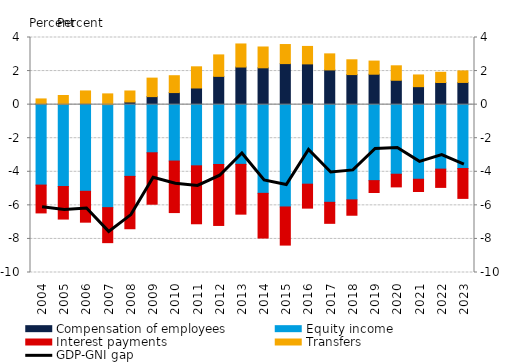
| Category | Compensation of employees | Equity income | Interest payments | Transfers |
|---|---|---|---|---|
| 2004.0 | 0.05 | -4.792 | -1.658 | 0.291 |
| 2005.0 | 0.026 | -4.878 | -1.939 | 0.519 |
| 2006.0 | 0.074 | -5.162 | -1.84 | 0.742 |
| 2007.0 | 0.004 | -6.136 | -2.086 | 0.637 |
| 2008.0 | 0.158 | -4.273 | -3.12 | 0.656 |
| 2009.0 | 0.479 | -2.868 | -3.065 | 1.101 |
| 2010.0 | 0.719 | -3.36 | -3.07 | 1.004 |
| 2011.0 | 0.992 | -3.645 | -3.452 | 1.262 |
| 2012.0 | 1.685 | -3.565 | -3.632 | 1.279 |
| 2013.0 | 2.241 | -3.558 | -2.966 | 1.374 |
| 2014.0 | 2.194 | -5.284 | -2.664 | 1.24 |
| 2015.0 | 2.445 | -6.096 | -2.272 | 1.136 |
| 2016.0 | 2.428 | -4.738 | -1.427 | 1.04 |
| 2017.0 | 2.068 | -5.82 | -1.251 | 0.957 |
| 2018.0 | 1.792 | -5.673 | -0.916 | 0.88 |
| 2019.0 | 1.813 | -4.527 | -0.708 | 0.782 |
| 2020.0 | 1.452 | -4.146 | -0.754 | 0.862 |
| 2021.0 | 1.071 | -4.444 | -0.732 | 0.698 |
| 2022.0 | 1.32 | -3.842 | -1.088 | 0.607 |
| 2023.0 | 1.323 | -3.806 | -1.779 | 0.685 |